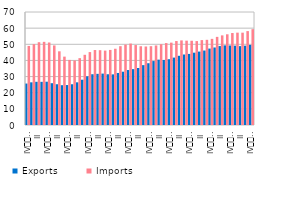
| Category | Exports | Imports |
|---|---|---|
| IV
2007 | 25.685 | 48.988 |
| I | 26.435 | 50.079 |
| II | 26.762 | 51.284 |
| III | 26.745 | 51.516 |
| IV
2008 | 26.815 | 51.116 |
| I | 25.895 | 49.29 |
| II | 25.249 | 45.652 |
| III | 24.656 | 42.354 |
| IV
2009 | 24.756 | 40.32 |
| I | 25.245 | 39.961 |
| II | 26.435 | 41.413 |
| III | 28.059 | 43.49 |
| IV
2010 | 30.174 | 45.17 |
| I | 31.45 | 46.443 |
| II | 31.688 | 46.344 |
| III | 31.841 | 46.086 |
| IV
2011 | 31.438 | 46.506 |
| I | 31.357 | 47.241 |
| II | 32.233 | 48.822 |
| III | 33.016 | 49.83 |
| IV
2012 | 34.052 | 50.45 |
| I | 34.607 | 49.528 |
| II | 35.308 | 48.789 |
| III | 37.081 | 48.635 |
| IV
2013 | 38.263 | 48.82 |
| I | 39.61 | 49.276 |
| II | 40.486 | 50.052 |
| III | 40.292 | 50.758 |
| IV
2014 | 40.743 | 51.021 |
| I | 41.753 | 52.012 |
| II | 42.869 | 52.412 |
| III | 43.67 | 52.242 |
| IV
2015 | 44.034 | 52.197 |
| I | 44.801 | 51.988 |
| II | 45.482 | 52.59 |
| III | 46.131 | 52.766 |
| IV
2016 | 47.342 | 53.366 |
| I | 48.013 | 54.597 |
| II | 48.893 | 55.523 |
| III | 49.328 | 56.197 |
| IV
2017 | 49.247 | 56.977 |
| I | 49.161 | 57.209 |
| II | 48.853 | 57.196 |
| III | 49.149 | 58.172 |
| IV
2018 | 49.644 | 59.353 |